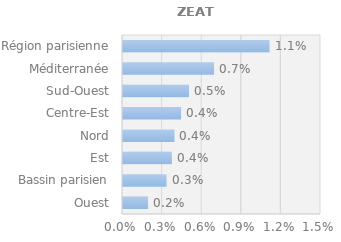
| Category | Series 0 |
|---|---|
| Ouest | 0.002 |
| Bassin parisien | 0.003 |
| Est | 0.004 |
| Nord | 0.004 |
| Centre-Est | 0.004 |
| Sud-Ouest | 0.005 |
| Méditerranée | 0.007 |
| Région parisienne | 0.011 |